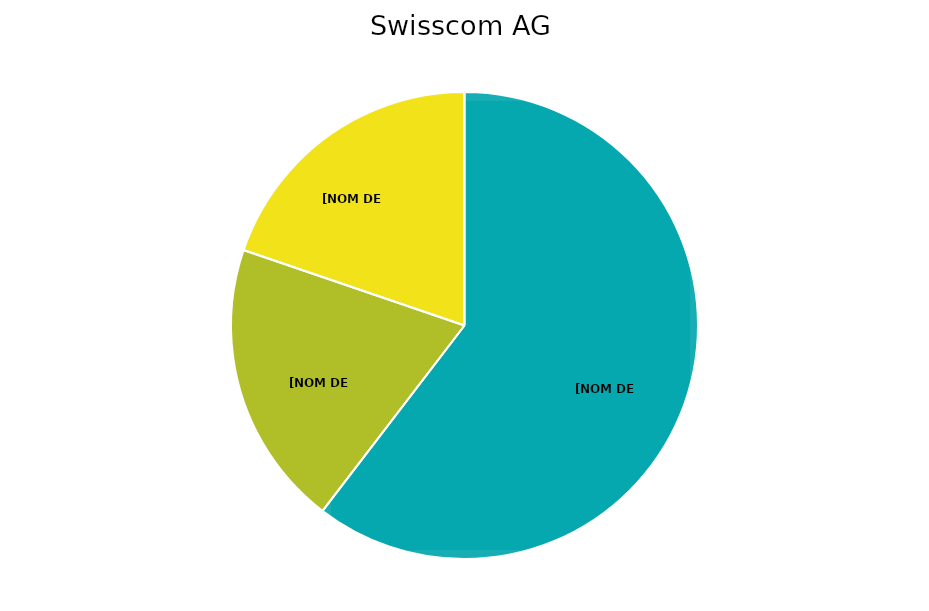
| Category | Series 0 |
|---|---|
| Swisscom AG | 0.493 |
| UPC GmbH | 0.162 |
| Sunrise Communications AG | 0.161 |